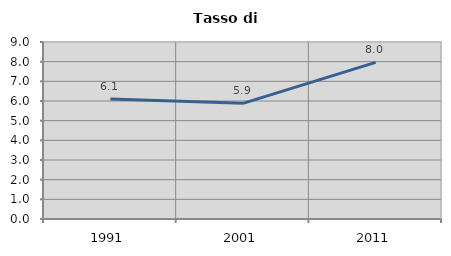
| Category | Tasso di disoccupazione   |
|---|---|
| 1991.0 | 6.101 |
| 2001.0 | 5.882 |
| 2011.0 | 7.966 |